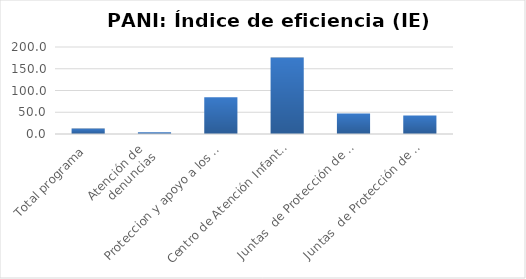
| Category | Índice de eficiencia (IE)  |
|---|---|
| Total programa | 12.498 |
| Atención de 
denuncias | 4.229 |
| Proteccion y apoyo a los niños, niñas y Adolescenres en los Albergues PANI | 84.486 |
| Centro de Atención Infantil - Guarderias | 175.774 |
| Juntas  de Protección de niñez y adolescencia - Promoción  | 47.303 |
| Juntas  de Protección de niñez y adolescencia - Prevención | 42.707 |